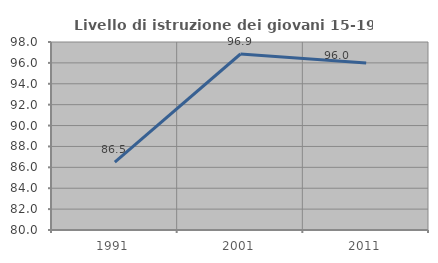
| Category | Livello di istruzione dei giovani 15-19 anni |
|---|---|
| 1991.0 | 86.498 |
| 2001.0 | 96.85 |
| 2011.0 | 96 |